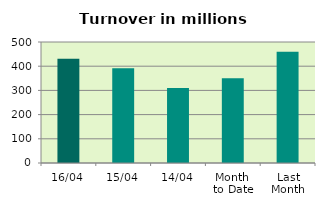
| Category | Series 0 |
|---|---|
| 16/04 | 431.261 |
| 15/04 | 391.537 |
| 14/04 | 309.92 |
| Month 
to Date | 349.896 |
| Last
Month | 459.546 |